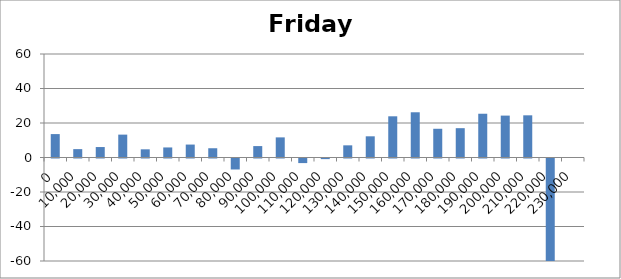
| Category | Friday 48 |
|---|---|
| 0.0 | 13.574 |
| 10000.0 | 4.858 |
| 20000.0 | 6.063 |
| 30000.0 | 13.263 |
| 40000.0 | 4.742 |
| 50000.0 | 5.826 |
| 60000.0 | 7.5 |
| 70000.0 | 5.368 |
| 80000.0 | -6.368 |
| 90000.0 | 6.621 |
| 100000.0 | 11.663 |
| 110000.0 | -2.663 |
| 120000.0 | -0.358 |
| 130000.0 | 7.053 |
| 140000.0 | 12.284 |
| 150000.0 | 23.884 |
| 160000.0 | 26.221 |
| 170000.0 | 16.653 |
| 180000.0 | 17 |
| 190000.0 | 25.368 |
| 200000.0 | 24.29 |
| 210000.0 | 24.456 |
| 220000.0 | -118.6 |
| 230000.0 | 0 |